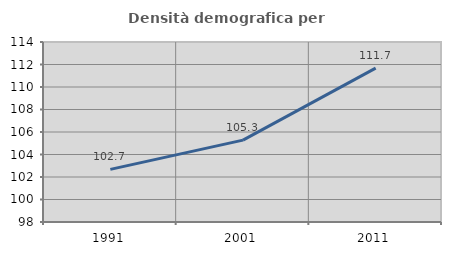
| Category | Densità demografica |
|---|---|
| 1991.0 | 102.679 |
| 2001.0 | 105.276 |
| 2011.0 | 111.678 |